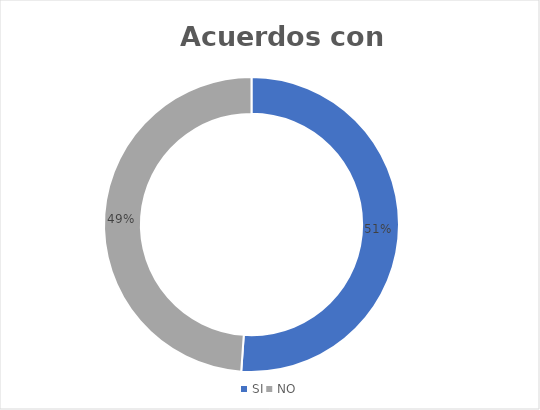
| Category | Series 0 |
|---|---|
| SI | 46 |
| NO | 44 |